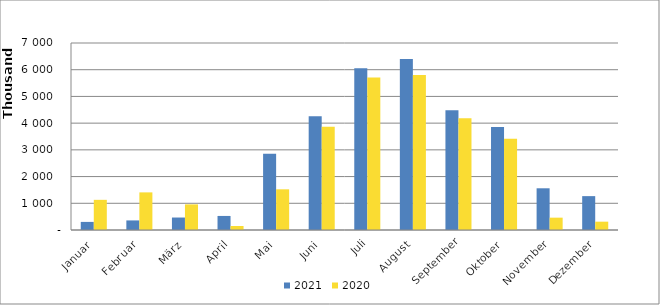
| Category | 2021 | 2020 |
|---|---|---|
| Januar | 302927 | 1129233 |
| Februar | 358598 | 1408128 |
| März | 466886 | 958998 |
| April | 526179 | 148793 |
| Mai | 2850171 | 1522840 |
| Juni | 4255276 | 3867643 |
| Juli | 6055301 | 5709434 |
| August | 6400538 | 5802579 |
| September | 4482942 | 4183912 |
| Oktober | 3856933 | 3419058 |
| November | 1561347 | 461976 |
| Dezember | 1267939 | 311727 |